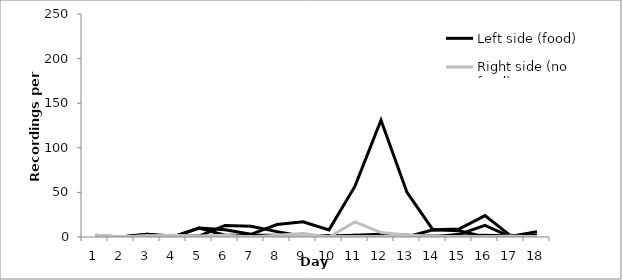
| Category | Left side (food) | Series 1 | Series 2 | Series 3 | Series 4 | Series 5 | Right side (no food) | Series 7 | Series 8 | Series 9 | Series 10 | Series 11 |
|---|---|---|---|---|---|---|---|---|---|---|---|---|
| 0 | 1 | 1 | 1 | 1 | 1 | 1 | 2 | 2 | 2 | 2 | 2 | 2 |
| 1 | 0 | 0 | 0 | 0 | 0 | 0 | 0 | 0 | 0 | 0 | 0 | 0 |
| 2 | 3 | 3 | 0 | 0 | 0 | 0 | 1 | 1 | 1 | 0 | 0 | 0 |
| 3 | 0 | 1 | 0 | 0 | 0 | 0 | 2 | 1 | 0 | 2 | 0 | 0 |
| 4 | 10 | 1 | 10 | 0 | 0 | 0 | 0 | 1 | 0 | 0 | 0 | 0 |
| 5 | 2 | 13 | 8 | 1 | 1 | 0 | 0 | 2 | 1 | 1 | 0 | 0 |
| 6 | 2 | 12 | 3 | 0 | 0 | 0 | 0 | 0 | 0 | 0 | 0 | 0 |
| 7 | 2 | 6 | 14 | 0 | 0 | 0 | 0 | 2 | 0 | 0 | 0 | 0 |
| 8 | 0 | 1 | 17 | 0 | 0 | 0 | 1 | 4 | 0 | 0 | 0 | 0 |
| 9 | 0 | 1 | 8 | 1 | 0 | 1 | 0 | 0 | 0 | 0 | 0 | 0 |
| 10 | 2 | 2 | 57 | 0 | 0 | 0 | 0 | 17 | 0 | 0 | 0 | 0 |
| 11 | 0 | 3 | 131 | 1 | 0 | 0 | 0 | 5 | 0 | 0 | 0 | 0 |
| 12 | 1 | 2 | 50 | 0 | 0 | 0 | 0 | 2 | 0 | 0 | 0 | 0 |
| 13 | 0 | 1 | 8 | 0 | 0 | 8 | 0 | 1 | 0 | 0 | 0 | 0 |
| 14 | 3 | 1 | 9 | 0 | 0 | 7 | 0 | 0 | 0 | 0 | 0 | 0 |
| 15 | 13 | 2 | 24 | 0 | 0 | 0 | 0 | 0 | 0 | 0 | 0 | 0 |
| 16 | 0 | 1 | 1 | 0 | 0 | 2 | 0 | 1 | 0 | 0 | 0 | 0 |
| 17 | 2 | 0 | 6 | 0 | 0 | 0 | 0 | 0 | 0 | 0 | 0 | 0 |